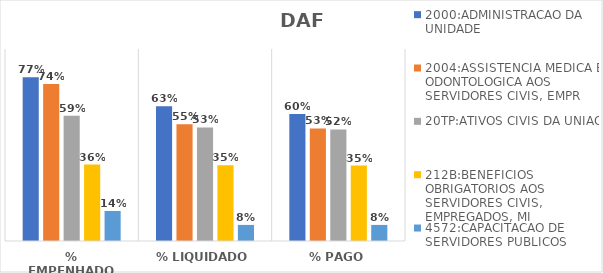
| Category | 2000:ADMINISTRACAO DA UNIDADE | 2004:ASSISTENCIA MEDICA E ODONTOLOGICA AOS SERVIDORES CIVIS, EMPR | 20TP:ATIVOS CIVIS DA UNIAO | 212B:BENEFICIOS OBRIGATORIOS AOS SERVIDORES CIVIS, EMPREGADOS, MI | 4572:CAPACITACAO DE SERVIDORES PUBLICOS FEDERAIS EM PROCESSO DE Q |
|---|---|---|---|---|---|
| % EMPENHADO | 0.767 | 0.736 | 0.587 | 0.358 | 0.141 |
| % LIQUIDADO | 0.632 | 0.547 | 0.532 | 0.355 | 0.075 |
| % PAGO | 0.595 | 0.528 | 0.523 | 0.354 | 0.075 |